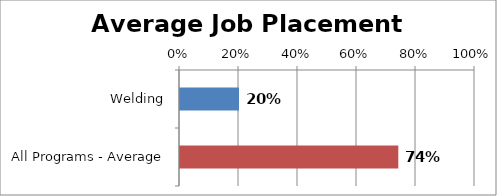
| Category | Series 0 |
|---|---|
| Welding | 0.2 |
| All Programs - Average | 0.74 |